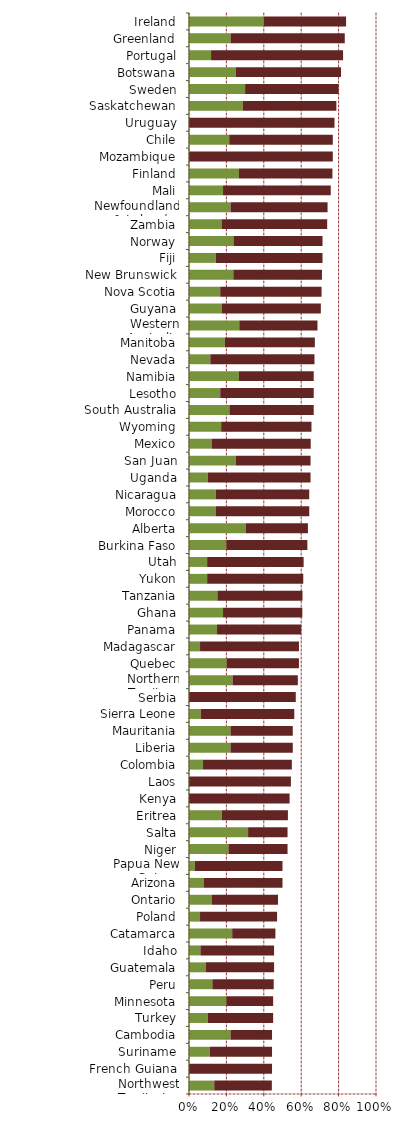
| Category | Series 0 | Series 1 |
|---|---|---|
| Northwest Territories | 0.135 | 0.308 |
| French Guiana | 0 | 0.444 |
| Suriname | 0.111 | 0.333 |
| Cambodia | 0.222 | 0.222 |
| Turkey | 0.1 | 0.35 |
| Minnesota | 0.2 | 0.25 |
| Peru | 0.125 | 0.328 |
| Guatemala | 0.091 | 0.364 |
| Idaho | 0.061 | 0.394 |
| Catamarca | 0.231 | 0.231 |
| Poland | 0.059 | 0.412 |
| Ontario | 0.121 | 0.355 |
| Arizona | 0.078 | 0.422 |
| Papua New Guinea | 0.031 | 0.469 |
| Niger | 0.211 | 0.316 |
| Salta | 0.316 | 0.211 |
| Eritrea | 0.176 | 0.353 |
| Kenya | 0 | 0.538 |
| Laos | 0 | 0.545 |
| Colombia | 0.075 | 0.475 |
| Liberia | 0.222 | 0.333 |
| Mauritania | 0.222 | 0.333 |
| Sierra Leone | 0.063 | 0.5 |
| Serbia | 0 | 0.571 |
| Northern Territory | 0.233 | 0.349 |
| Quebec | 0.202 | 0.386 |
| Madagascar | 0.059 | 0.529 |
| Panama | 0.15 | 0.45 |
| Ghana | 0.182 | 0.424 |
| Tanzania | 0.152 | 0.455 |
| Yukon | 0.097 | 0.514 |
| Utah | 0.097 | 0.516 |
| Burkina Faso | 0.2 | 0.433 |
| Alberta | 0.303 | 0.333 |
| Morocco | 0.143 | 0.5 |
| Nicaragua | 0.143 | 0.5 |
| Uganda | 0.1 | 0.55 |
| San Juan | 0.25 | 0.4 |
| Mexico | 0.121 | 0.53 |
| Wyoming | 0.172 | 0.483 |
| South Australia | 0.216 | 0.451 |
| Lesotho | 0.167 | 0.5 |
| Namibia | 0.267 | 0.4 |
| Nevada | 0.114 | 0.557 |
| Manitoba | 0.192 | 0.481 |
| Western Australia | 0.269 | 0.418 |
| Guyana | 0.176 | 0.529 |
| Nova Scotia | 0.167 | 0.542 |
| New Brunswick | 0.237 | 0.474 |
| Fiji | 0.143 | 0.571 |
| Norway | 0.238 | 0.476 |
| Zambia | 0.174 | 0.565 |
| Newfoundland & Labrador | 0.222 | 0.519 |
| Mali | 0.182 | 0.576 |
| Finland | 0.267 | 0.5 |
| Mozambique | 0 | 0.769 |
| Chile | 0.215 | 0.554 |
| Uruguay | 0 | 0.778 |
| Saskatchewan | 0.288 | 0.5 |
| Sweden | 0.3 | 0.5 |
| Botswana | 0.25 | 0.563 |
| Portugal | 0.118 | 0.706 |
| Greenland | 0.222 | 0.611 |
| Ireland | 0.4 | 0.44 |